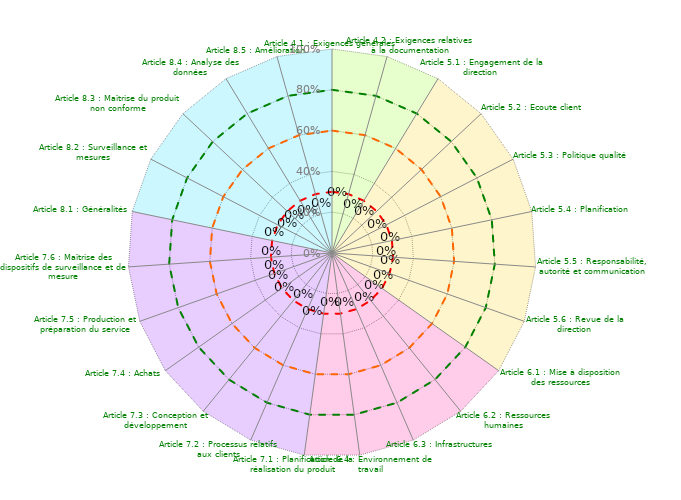
| Category | Coloriage Art 4 | Coloriage Art 5 | Coloriage Art  6 | Coloriage Art 7 | Coloriage Art 8 | Conforme | Convaincant | Informel | Résultat |
|---|---|---|---|---|---|---|---|---|---|
| Article 4.1 : Exigences générales | 1 | 0 | 0 | 0 | 1 | 0.8 | 0.6 | 0.3 | 0 |
| Article 4.2 : Exigences relatives à la documentation | 1 | 0 | 0 | 0 | 0 | 0.8 | 0.6 | 0.3 | 0 |
| Article 5.1 : Engagement de la direction | 1 | 1 | 0 | 0 | 0 | 0.8 | 0.6 | 0.3 | 0 |
| Article 5.2 : Ecoute client | 0 | 1 | 0 | 0 | 0 | 0.8 | 0.6 | 0.3 | 0 |
| Article 5.3 : Politique qualité | 0 | 1 | 0 | 0 | 0 | 0.8 | 0.6 | 0.3 | 0 |
| Article 5.4 : Planification | 0 | 1 | 0 | 0 | 0 | 0.8 | 0.6 | 0.3 | 0 |
| Article 5.5 : Responsabilité, autorité et communication | 0 | 1 | 0 | 0 | 0 | 0.8 | 0.6 | 0.3 | 0 |
| Article 5.6 : Revue de la direction | 0 | 1 | 0 | 0 | 0 | 0.8 | 0.6 | 0.3 | 0 |
| Article 6.1 : Mise à disposition des ressources | 0 | 1 | 1 | 0 | 0 | 0.8 | 0.6 | 0.3 | 0 |
| Article 6.2 : Ressources humaines | 0 | 0 | 1 | 0 | 0 | 0.8 | 0.6 | 0.3 | 0 |
| Article 6.3 : Infrastructures | 0 | 0 | 1 | 0 | 0 | 0.8 | 0.6 | 0.3 | 0 |
| Article 6.4 : Environnement de travail | 0 | 0 | 1 | 0 | 0 | 0.8 | 0.6 | 0.3 | 0 |
| Article 7.1 : Planification de la réalisation du produit | 0 | 0 | 1 | 1 | 0 | 0.8 | 0.6 | 0.3 | 0 |
| Article 7.2 : Processus relatifs aux clients | 0 | 0 | 0 | 1 | 0 | 0.8 | 0.6 | 0.3 | 0 |
| Article 7.3 : Conception et développement | 0 | 0 | 0 | 1 | 0 | 0.8 | 0.6 | 0.3 | 0 |
| Article 7.4 : Achats | 0 | 0 | 0 | 1 | 0 | 0.8 | 0.6 | 0.3 | 0 |
| Article 7.5 : Production et préparation du service | 0 | 0 | 0 | 1 | 0 | 0.8 | 0.6 | 0.3 | 0 |
| Article 7.6 : Maîtrise des dispositifs de surveillance et de mesure | 0 | 0 | 0 | 1 | 0 | 0.8 | 0.6 | 0.3 | 0 |
| Article 8.1 : Généralités | 0 | 0 | 0 | 1 | 1 | 0.8 | 0.6 | 0.3 | 0 |
| Article 8.2 : Surveillance et mesures | 0 | 0 | 0 | 0 | 1 | 0.8 | 0.6 | 0.3 | 0 |
| Article 8.3 : Maîtrise du produit non conforme | 0 | 0 | 0 | 0 | 1 | 0.8 | 0.6 | 0.3 | 0 |
| Article 8.4 : Analyse des données | 0 | 0 | 0 | 0 | 1 | 0.8 | 0.6 | 0.3 | 0 |
| Article 8.5 : Amélioration | 0 | 0 | 0 | 0 | 1 | 0.8 | 0.6 | 0.3 | 0 |